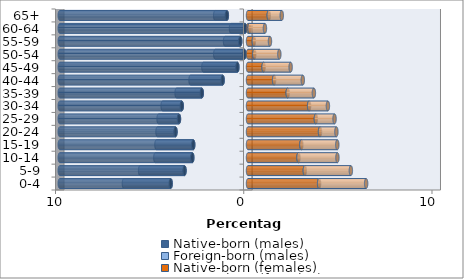
| Category | Native-born (males) | Foreign-born (males) | Native-born (females) | Foreign-born (females) |
|---|---|---|---|---|
| 0-4 | -4.108 | -2.485 | 3.777 | 2.499 |
| 5-9 | -3.373 | -2.36 | 3.018 | 2.446 |
| 10-14 | -2.959 | -1.963 | 2.681 | 2.07 |
| 15-19 | -2.909 | -1.955 | 2.834 | 1.909 |
| 20-24 | -3.852 | -0.956 | 3.825 | 0.87 |
| 25-29 | -3.667 | -1.082 | 3.604 | 0.993 |
| 30-34 | -3.519 | -1.016 | 3.245 | 1 |
| 35-39 | -2.454 | -1.339 | 2.109 | 1.391 |
| 40-44 | -1.347 | -1.706 | 1.386 | 1.525 |
| 45-49 | -0.564 | -1.807 | 0.827 | 1.437 |
| 50-54 | -0.193 | -1.548 | 0.333 | 1.331 |
| 55-59 | -0.414 | -0.806 | 0.311 | 0.856 |
| 60-64 | -0.156 | -0.747 | 0.083 | 0.817 |
| 65+ | -1.123 | -0.62 | 1.103 | 0.69 |